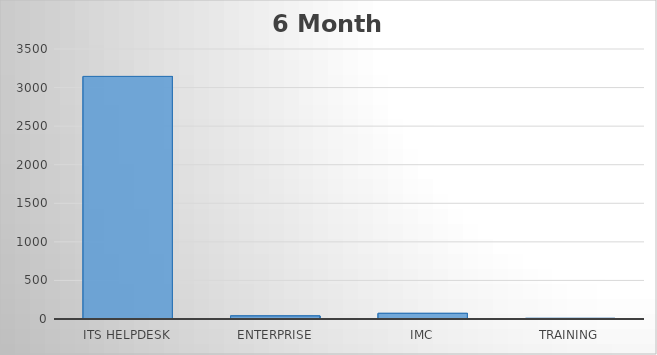
| Category | Series 0 |
|---|---|
| ITS Helpdesk | 3144 |
| Enterprise | 40 |
| IMC | 73 |
| Training | 8 |